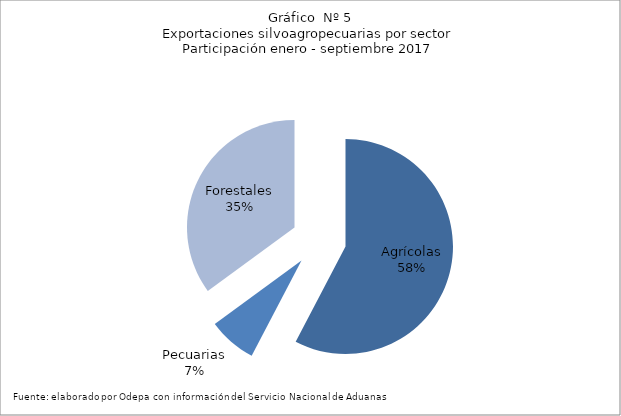
| Category | Series 0 |
|---|---|
| Agrícolas | 7045628 |
| Pecuarias | 887304 |
| Forestales | 4283932 |